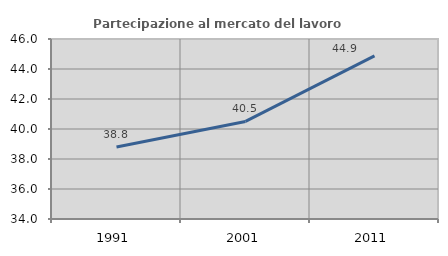
| Category | Partecipazione al mercato del lavoro  femminile |
|---|---|
| 1991.0 | 38.806 |
| 2001.0 | 40.506 |
| 2011.0 | 44.878 |